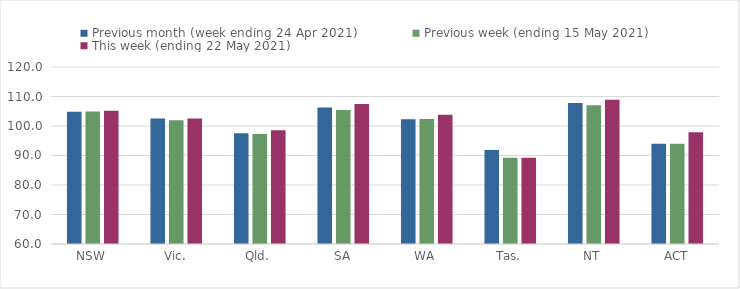
| Category | Previous month (week ending 24 Apr 2021) | Previous week (ending 15 May 2021) | This week (ending 22 May 2021) |
|---|---|---|---|
| NSW | 104.87 | 104.9 | 105.19 |
| Vic. | 102.53 | 101.98 | 102.56 |
| Qld. | 97.51 | 97.31 | 98.57 |
| SA | 106.25 | 105.43 | 107.48 |
| WA | 102.27 | 102.36 | 103.78 |
| Tas. | 91.85 | 89.2 | 89.2 |
| NT | 107.77 | 107.04 | 108.93 |
| ACT | 94 | 94 | 97.92 |